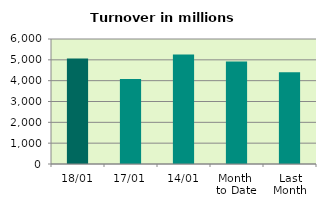
| Category | Series 0 |
|---|---|
| 18/01 | 5068.044 |
| 17/01 | 4082.608 |
| 14/01 | 5257.763 |
| Month 
to Date | 4917.337 |
| Last
Month | 4407.558 |